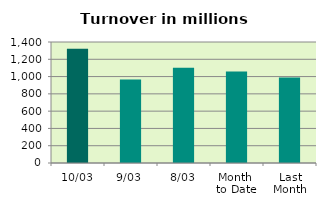
| Category | Series 0 |
|---|---|
| 10/03 | 1321.372 |
| 9/03 | 964.675 |
| 8/03 | 1101.125 |
| Month 
to Date | 1058.547 |
| Last
Month | 989.924 |